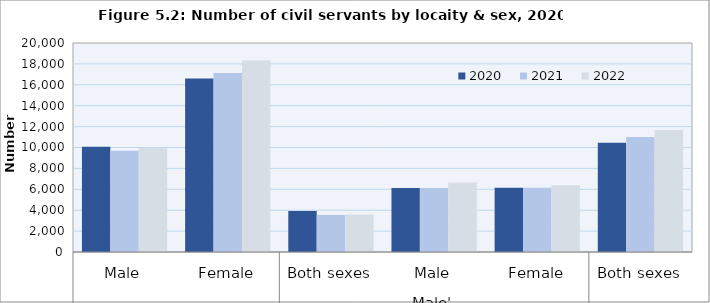
| Category | 2020 | 2021 | 2022 |
|---|---|---|---|
| 0 | 10075 | 9695 | 9975 |
| 1 | 16593 | 17139 | 18319 |
| 2 | 3932 | 3547 | 3583 |
| 3 | 6135 | 6136 | 6648 |
| 4 | 6143 | 6148 | 6392 |
| 5 | 10458 | 11003 | 11671 |